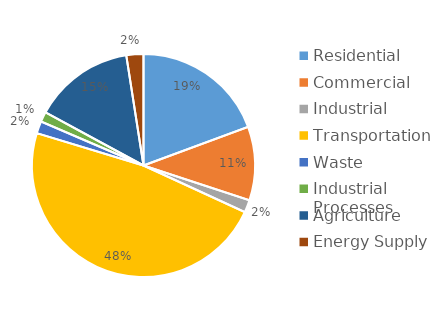
| Category | Series 0 |
|---|---|
| Residential | 106855 |
| Commercial | 58874 |
| Industrial | 10002 |
| Transportation | 263772 |
| Waste | 9761 |
| Industrial Processes | 8071 |
| Agriculture | 80604 |
| Energy Supply | 13628 |